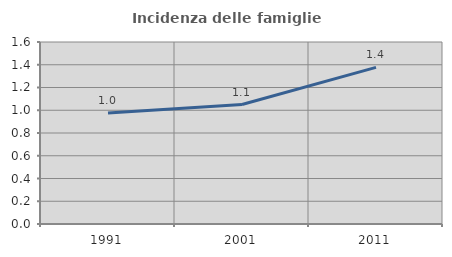
| Category | Incidenza delle famiglie numerose |
|---|---|
| 1991.0 | 0.975 |
| 2001.0 | 1.05 |
| 2011.0 | 1.377 |